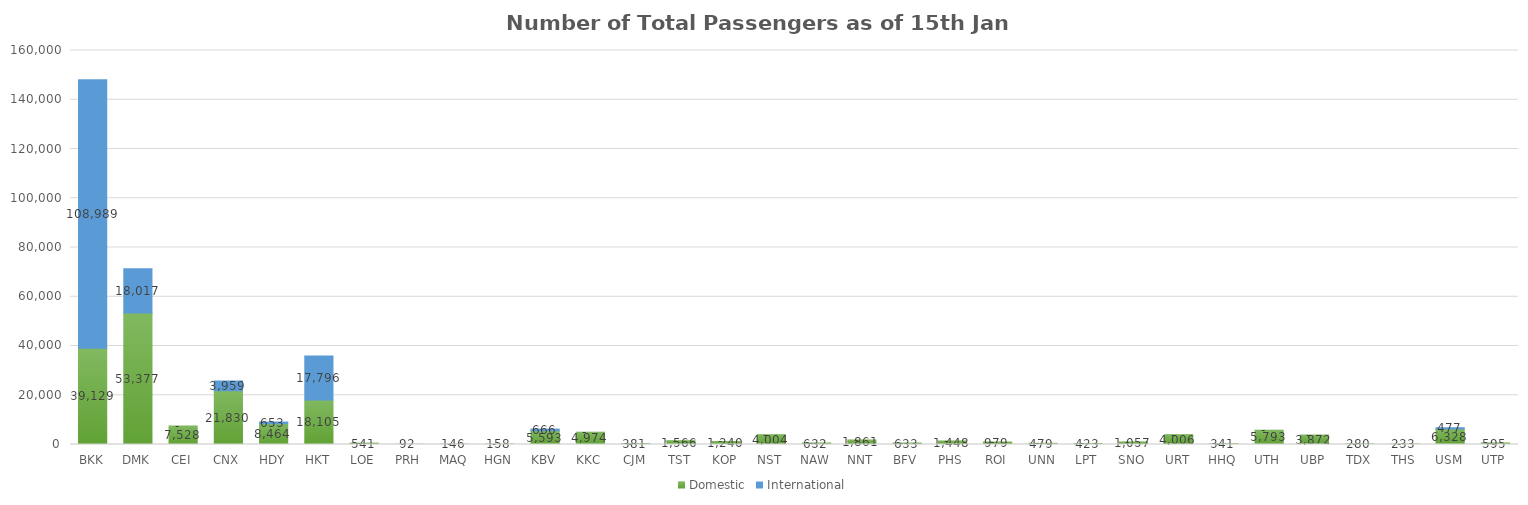
| Category | Domestic | International |
|---|---|---|
| BKK | 39129 | 108989 |
| DMK | 53377 | 18017 |
| CEI | 7528 | 0 |
| CNX | 21830 | 3959 |
| HDY | 8464 | 653 |
| HKT | 18105 | 17796 |
| LOE | 541 | 0 |
| PRH | 92 | 0 |
| MAQ | 146 | 0 |
| HGN | 158 | 0 |
| KBV | 5593 | 666 |
| KKC | 4974 | 0 |
| CJM | 381 | 0 |
| TST | 1566 | 0 |
| KOP | 1240 | 0 |
| NST | 4004 | 0 |
| NAW | 632 | 0 |
| NNT | 1861 | 0 |
| BFV | 633 | 0 |
| PHS | 1448 | 0 |
| ROI | 979 | 0 |
| UNN | 479 | 0 |
| LPT | 423 | 0 |
| SNO | 1057 | 0 |
| URT | 4006 | 0 |
| HHQ | 341 | 0 |
| UTH | 5793 | 0 |
| UBP | 3872 | 0 |
| TDX | 280 | 0 |
| THS | 233 | 0 |
| USM | 6328 | 477 |
| UTP | 595 | 0 |